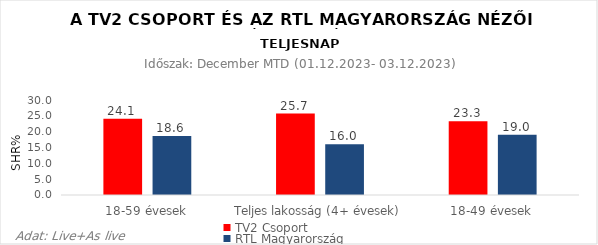
| Category | TV2 Csoport | RTL Magyarország |
|---|---|---|
| 18-59 évesek | 24.1 | 18.6 |
| Teljes lakosság (4+ évesek) | 25.7 | 16 |
| 18-49 évesek | 23.3 | 19 |